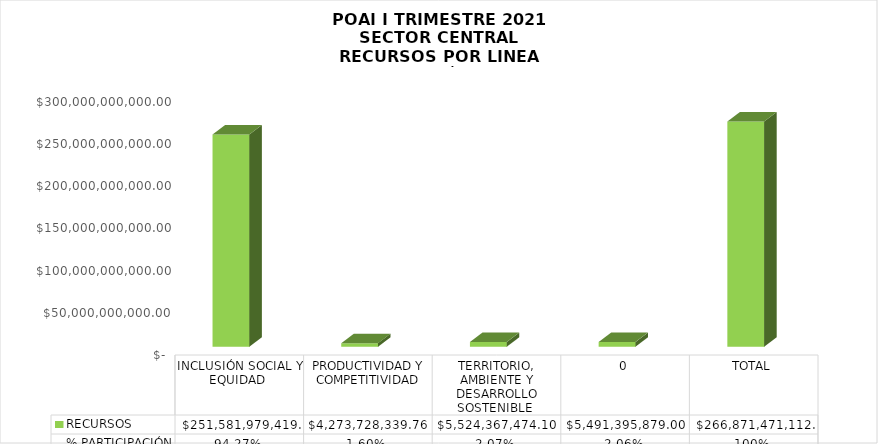
| Category | RECURSOS | % PARTICIPACIÓN |
|---|---|---|
| INCLUSIÓN SOCIAL Y EQUIDAD  | 251581979419.16 | 0.943 |
| PRODUCTIVIDAD Y COMPETITIVIDAD | 4273728339.76 | 0.016 |
| TERRITORIO, AMBIENTE Y DESARROLLO SOSTENIBLE  | 5524367474.1 | 0.021 |
| 0 | 5491395879 | 0.021 |
| TOTAL | 266871471112.02 | 1 |